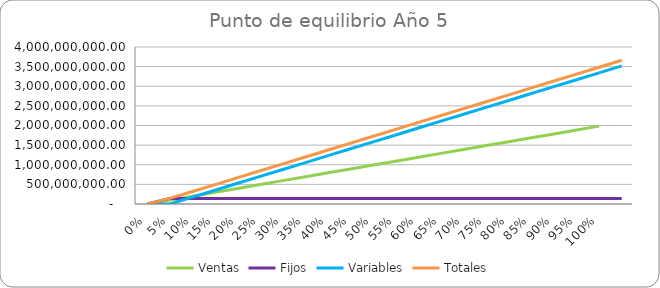
| Category | Ventas | Fijos | Variables | Totales |
|---|---|---|---|---|
| 0.0 | 0 | 0 | 0 | 0 |
| 0.05 | 99225000 | 143225121.942 | 0 | 143225121.942 |
| 0.1 | 198450000 | 143225121.942 | 175895384.781 | 319120506.723 |
| 0.15 | 297675000 | 143225121.942 | 351790769.562 | 495015891.504 |
| 0.2 | 396900000 | 143225121.942 | 527686154.343 | 670911276.285 |
| 0.25 | 496125000 | 143225121.942 | 703581539.125 | 846806661.066 |
| 0.3 | 595350000 | 143225121.942 | 879476923.906 | 1022702045.847 |
| 0.35 | 694575000 | 143225121.942 | 1055372308.687 | 1198597430.628 |
| 0.4 | 793800000 | 143225121.942 | 1231267693.468 | 1374492815.409 |
| 0.45 | 893025000 | 143225121.942 | 1407163078.249 | 1550388200.191 |
| 0.5 | 992250000 | 143225121.942 | 1583058463.03 | 1726283584.972 |
| 0.55 | 1091475000 | 143225121.942 | 1758953847.811 | 1902178969.753 |
| 0.6 | 1190700000 | 143225121.942 | 1934849232.592 | 2078074354.534 |
| 0.65 | 1289925000 | 143225121.942 | 2110744617.374 | 2253969739.315 |
| 0.7 | 1389150000 | 143225121.942 | 2286640002.155 | 2429865124.096 |
| 0.75 | 1488375000 | 143225121.942 | 2462535386.936 | 2605760508.877 |
| 0.8 | 1587600000 | 143225121.942 | 2638430771.717 | 2781655893.658 |
| 0.85 | 1686825000 | 143225121.942 | 2814326156.498 | 2957551278.44 |
| 0.9 | 1786050000 | 143225121.942 | 2990221541.279 | 3133446663.221 |
| 0.95 | 1885275000 | 143225121.942 | 3166116926.06 | 3309342048.002 |
| 1.0 | 1984500000 | 143225121.942 | 3342012310.841 | 3485237432.783 |